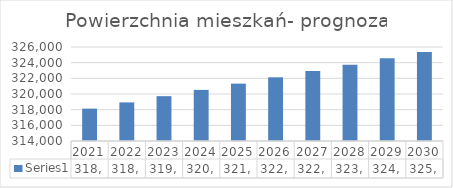
| Category | Series 0 |
|---|---|
| 2021.0 | 318132.348 |
| 2022.0 | 318927.678 |
| 2023.0 | 319724.998 |
| 2024.0 | 320524.31 |
| 2025.0 | 321325.621 |
| 2026.0 | 322128.935 |
| 2027.0 | 322934.257 |
| 2028.0 | 323741.593 |
| 2029.0 | 324550.947 |
| 2030.0 | 325362.324 |